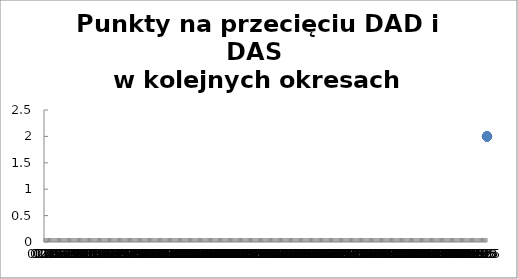
| Category | Series 0 |
|---|---|
| 100.0 | 2 |
| 100.0 | 2 |
| 100.0 | 2 |
| 100.0 | 2 |
| 100.0 | 2 |
| 100.0 | 2 |
| 100.0 | 2 |
| 100.0 | 2 |
| 100.0 | 2 |
| 100.0 | 2 |
| 100.0 | 2 |
| 100.0 | 2 |
| 100.0 | 2 |
| 100.0 | 2 |
| 100.0 | 2 |
| 100.0 | 2 |
| 100.0 | 2 |
| 100.0 | 2 |
| 100.0 | 2 |
| 100.0 | 2 |
| 100.0 | 2 |
| 100.0 | 2 |
| 100.0 | 2 |
| 100.0 | 2 |
| 100.0 | 2 |
| 100.0 | 2 |
| 100.0 | 2 |
| 100.0 | 2 |
| 100.0 | 2 |
| 100.0 | 2 |
| 100.0 | 2 |
| 100.0 | 2 |
| 100.0 | 2 |
| 100.0 | 2 |
| 100.0 | 2 |
| 100.0 | 2 |
| 100.0 | 2 |
| 100.0 | 2 |
| 100.0 | 2 |
| 100.0 | 2 |
| 100.0 | 2 |
| 100.0 | 2 |
| 100.0 | 2 |
| 100.0 | 2 |
| 100.0 | 2 |
| 100.0 | 2 |
| 100.0 | 2 |
| 100.0 | 2 |
| 100.0 | 2 |
| 100.0 | 2 |
| 100.0 | 2 |
| 100.0 | 2 |
| 100.0 | 2 |
| 100.0 | 2 |